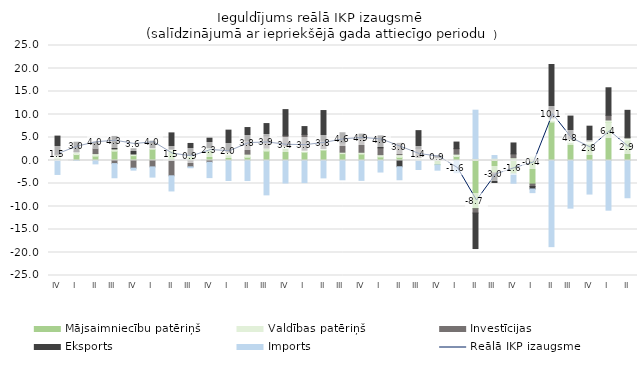
| Category | Mājsaimniecību patēriņš | Valdības patēriņš | Investīcijas | Eksports | Imports |
|---|---|---|---|---|---|
| IV | 0.524 | 0.634 | 0.238 | 3.908 | -3.033 |
| I | 1.292 | 0.593 | 0.024 | 2.071 | -0.005 |
| II | 0.957 | 0.546 | 1.114 | 1.377 | -0.731 |
| III | 2.021 | 0.498 | -0.672 | 2.712 | -3.08 |
| IV | 1.05 | 0.365 | -1.669 | 1.141 | -0.425 |
| I | 2.447 | 0.323 | -1.389 | 1.43 | -2.22 |
| II | 2.159 | 0.313 | -3.328 | 3.531 | -3.292 |
| III | 0.891 | 0.378 | -1.378 | 2.438 | -0.2 |
| IV | 2.231 | 0.539 | -0.378 | 2.082 | -3.341 |
| I | 1.204 | 0.598 | 0.319 | 4.479 | -4.351 |
| II | 0.708 | 0.68 | 2.98 | 2.797 | -4.357 |
| III | 2.049 | 0.653 | 2.631 | 2.694 | -7.471 |
| IV | 2.612 | 0.535 | 2.344 | 5.575 | -4.89 |
| I | 1.814 | 0.428 | 3.444 | 1.69 | -4.805 |
| II | 2.269 | 0.329 | 1.822 | 6.44 | -3.777 |
| III | 1.491 | 0.315 | 2.036 | 2.191 | -4.193 |
| IV | 1.402 | 0.386 | 3.023 | 0.923 | -4.321 |
| I | 0.77 | 0.499 | 1.487 | 2.599 | -2.507 |
| II | 0.69 | 0.593 | 2.448 | -1.361 | -2.825 |
| III | 0.053 | 0.625 | 1.976 | 3.838 | -1.951 |
| IV | -0.943 | 0.581 | 0.254 | 0.198 | -1.155 |
| I | 0.878 | 0.507 | 1.189 | 1.433 | -2.659 |
| II | -10.465 | 0.433 | -0.958 | -7.717 | 10.507 |
| III | -2.689 | 0.488 | -0.413 | -1.683 | 0.591 |
| IV | -2.902 | 0.602 | 0.833 | 2.377 | -2.042 |
| I | -5.127 | 0.745 | -0.522 | -0.54 | -0.796 |
| II | 8.348 | 0.916 | 1.916 | 9.688 | -18.728 |
| III | 3.887 | 0.788 | 1.048 | 3.934 | -10.359 |
| IV | 3.583 | 0.641 | 0.083 | 3.155 | -7.295 |
| I | 8.314 | 0.489 | 1.025 | 5.983 | -10.8 |
| II | 4.467 | 0.423 | 0.146 | 5.872 | -8.097 |